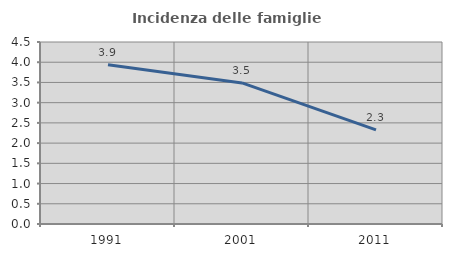
| Category | Incidenza delle famiglie numerose |
|---|---|
| 1991.0 | 3.939 |
| 2001.0 | 3.488 |
| 2011.0 | 2.326 |